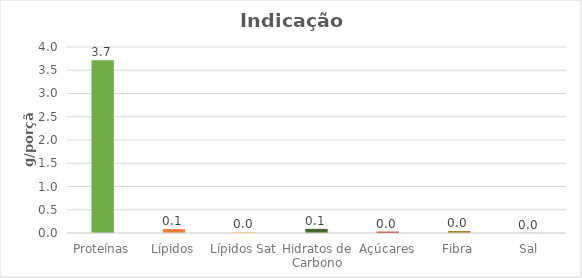
| Category | Series 0 |
|---|---|
| Proteínas | 3.717 |
| Lípidos | 0.083 |
| Lípidos Sat | 0.012 |
| Hidratos de Carbono | 0.089 |
| Açúcares | 0.029 |
| Fibra | 0.04 |
| Sal | 0.004 |